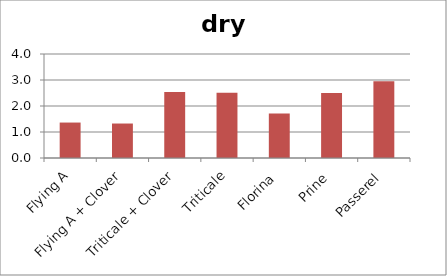
| Category | dry tons/acre |
|---|---|
| Flying A | 1.363 |
| Flying A + Clover | 1.326 |
| Triticale + Clover | 2.537 |
| Triticale | 2.507 |
| Florina | 1.711 |
| Prine | 2.503 |
| Passerel | 2.954 |